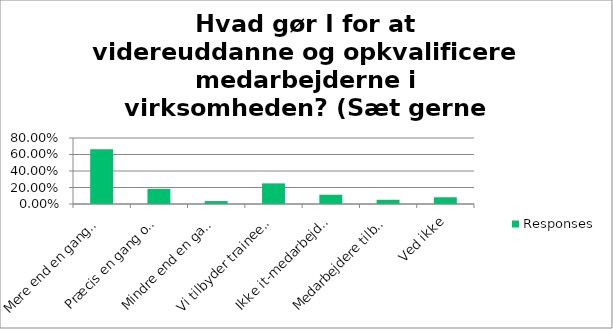
| Category | Responses |
|---|---|
| Mere end en gang om året har vi dialog med medarbejdere om dette | 0.663 |
| Præcis en gang om året har vi dialog med medarbejdere om dette - f.eks. ved MUS | 0.184 |
| Mindre end en gang om året har vi dialog med medarbejdere om dette | 0.036 |
| Vi tilbyder trainee/graduateforløb | 0.25 |
| Ikke it-medarbejdere tilbydes videreuddannelse/opkvalificering, så de kan varetage it-jobs | 0.112 |
| Medarbejdere tilbydes ikke videreuddannelse og opkvalificering af kompetencer | 0.051 |
| Ved ikke | 0.082 |